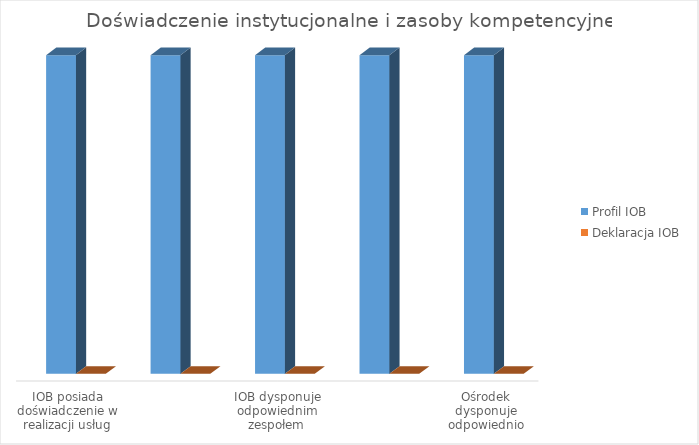
| Category | Profil IOB | Deklaracja IOB |
|---|---|---|
| IOB posiada doświadczenie w realizacji usług typowych dla wybranego typu IOB | 1 | 0 |
| IOB posiada doświadczenie w świadczeniu prorozwojowych usług doradczych | 1 | 0 |
| IOB dysponuje odpowiednim zespołem | 1 | 0 |
| Kadra IOB posiada doświadczenie w realizacji usług doardczych | 1 | 0 |
| Ośrodek dysponuje odpowiednio duzym zespołem konsultantów | 1 | 0 |